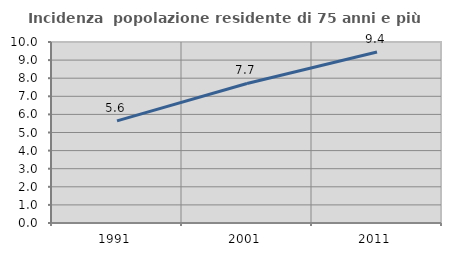
| Category | Incidenza  popolazione residente di 75 anni e più |
|---|---|
| 1991.0 | 5.644 |
| 2001.0 | 7.71 |
| 2011.0 | 9.444 |